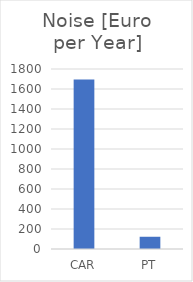
| Category | Series 0 |
|---|---|
| CAR | 1694.858 |
| PT | 122.4 |